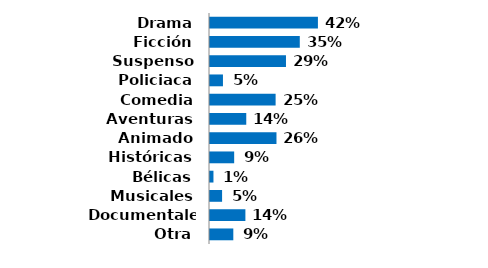
| Category | Series 0 |
|---|---|
| Drama | 0.417 |
| Ficción | 0.347 |
| Suspenso | 0.293 |
| Policiaca | 0.05 |
| Comedia | 0.253 |
| Aventuras | 0.14 |
| Animado | 0.257 |
| Históricas | 0.093 |
| Bélicas | 0.013 |
| Musicales | 0.047 |
| Documentales | 0.137 |
| Otra | 0.09 |